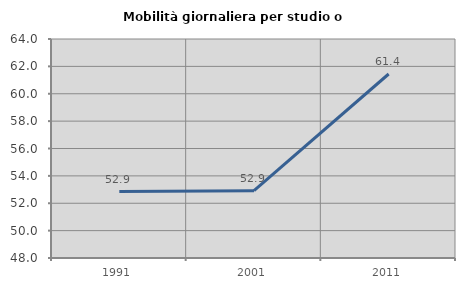
| Category | Mobilità giornaliera per studio o lavoro |
|---|---|
| 1991.0 | 52.854 |
| 2001.0 | 52.915 |
| 2011.0 | 61.443 |